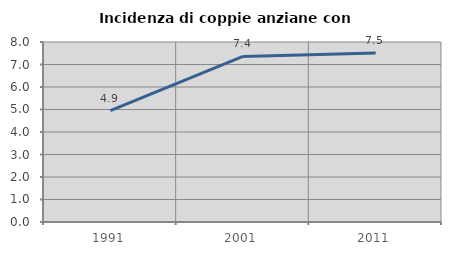
| Category | Incidenza di coppie anziane con figli |
|---|---|
| 1991.0 | 4.946 |
| 2001.0 | 7.359 |
| 2011.0 | 7.511 |